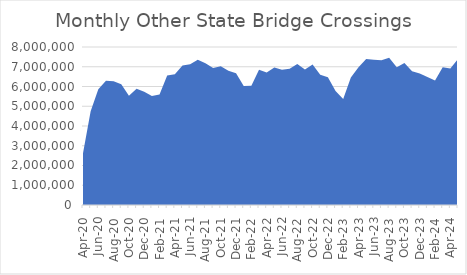
| Category | Number of Bridge Crossings |
|---|---|
| 2020-04-01 | 2617992 |
| 2020-05-01 | 4745633 |
| 2020-06-01 | 5856837 |
| 2020-07-01 | 6290371 |
| 2020-08-01 | 6260897 |
| 2020-09-01 | 6111347 |
| 2020-10-01 | 5533549 |
| 2020-11-01 | 5887519 |
| 2020-12-01 | 5737554 |
| 2021-01-01 | 5521839 |
| 2021-02-01 | 5599047 |
| 2021-03-01 | 6559287 |
| 2021-04-01 | 6620209 |
| 2021-05-01 | 7062323 |
| 2021-06-01 | 7126052 |
| 2021-07-01 | 7357246 |
| 2021-08-01 | 7171602 |
| 2021-09-01 | 6941161 |
| 2021-10-01 | 7022015 |
| 2021-11-01 | 6801585 |
| 2021-12-01 | 6667872 |
| 2022-01-01 | 6025847 |
| 2022-02-01 | 6036446 |
| 2022-03-01 | 6853492 |
| 2022-04-01 | 6708990 |
| 2022-05-01 | 6956649 |
| 2022-06-01 | 6847223 |
| 2022-07-01 | 6902801 |
| 2022-08-01 | 7139527 |
| 2022-09-01 | 6864207 |
| 2022-10-01 | 7114002 |
| 2022-11-01 | 6599555 |
| 2022-12-01 | 6465731 |
| 2023-01-01 | 5769969 |
| 2023-02-01 | 5364167 |
| 2023-03-01 | 6454883 |
| 2023-04-01 | 6974515 |
| 2023-05-01 | 7386359 |
| 2023-06-01 | 7351625 |
| 2023-07-01 | 7327483 |
| 2023-08-01 | 7452672 |
| 2023-09-01 | 6972622 |
| 2023-10-01 | 7192921 |
| 2023-11-01 | 6775420 |
| 2023-12-01 | 6656119 |
| 2024-01-01 | 6485811 |
| 2024-02-01 | 6304254 |
| 2024-03-01 | 6972065 |
| 2024-04-01 | 6912955 |
| 2024-05-01 | 7397319 |